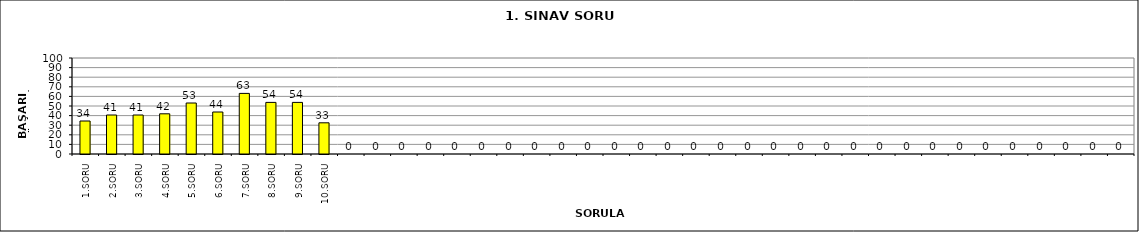
| Category | Series 0 |
|---|---|
| 1.SORU | 34.375 |
| 2.SORU | 40.625 |
| 3.SORU | 40.625 |
| 4.SORU | 41.875 |
| 5.SORU | 53.125 |
| 6.SORU | 43.75 |
| 7.SORU | 63.125 |
| 8.SORU | 53.75 |
| 9.SORU | 53.75 |
| 10.SORU | 32.5 |
|   | 0 |
|   | 0 |
|   | 0 |
|   | 0 |
|   | 0 |
|   | 0 |
|   | 0 |
|   | 0 |
|   | 0 |
|   | 0 |
|   | 0 |
|   | 0 |
|   | 0 |
|   | 0 |
|   | 0 |
|   | 0 |
|   | 0 |
|   | 0 |
|   | 0 |
|   | 0 |
|   | 0 |
|   | 0 |
|   | 0 |
|   | 0 |
|   | 0 |
|   | 0 |
|   | 0 |
|   | 0 |
|   | 0 |
|   | 0 |